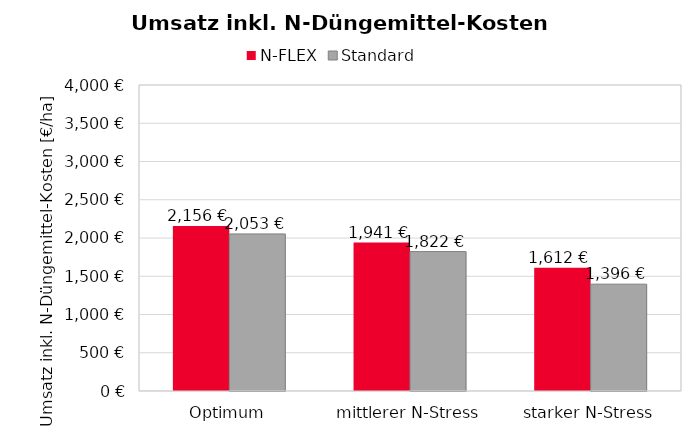
| Category | N-FLEX | Standard |
|---|---|---|
| Optimum | 2156.415 | 2053 |
| mittlerer N-Stress | 1940.691 | 1822.12 |
| starker N-Stress | 1612.089 | 1396.435 |